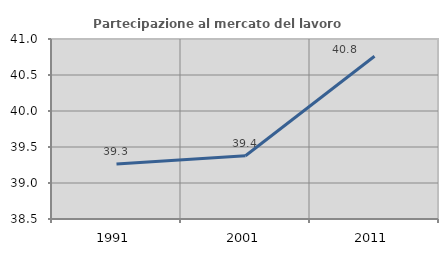
| Category | Partecipazione al mercato del lavoro  femminile |
|---|---|
| 1991.0 | 39.265 |
| 2001.0 | 39.378 |
| 2011.0 | 40.761 |